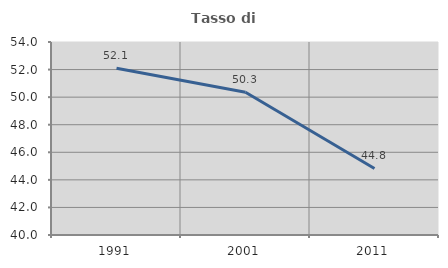
| Category | Tasso di occupazione   |
|---|---|
| 1991.0 | 52.096 |
| 2001.0 | 50.35 |
| 2011.0 | 44.828 |